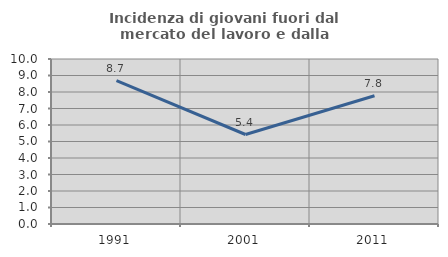
| Category | Incidenza di giovani fuori dal mercato del lavoro e dalla formazione  |
|---|---|
| 1991.0 | 8.696 |
| 2001.0 | 5.424 |
| 2011.0 | 7.774 |